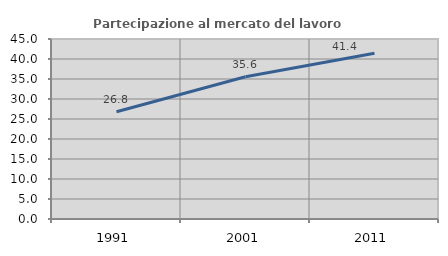
| Category | Partecipazione al mercato del lavoro  femminile |
|---|---|
| 1991.0 | 26.829 |
| 2001.0 | 35.57 |
| 2011.0 | 41.429 |